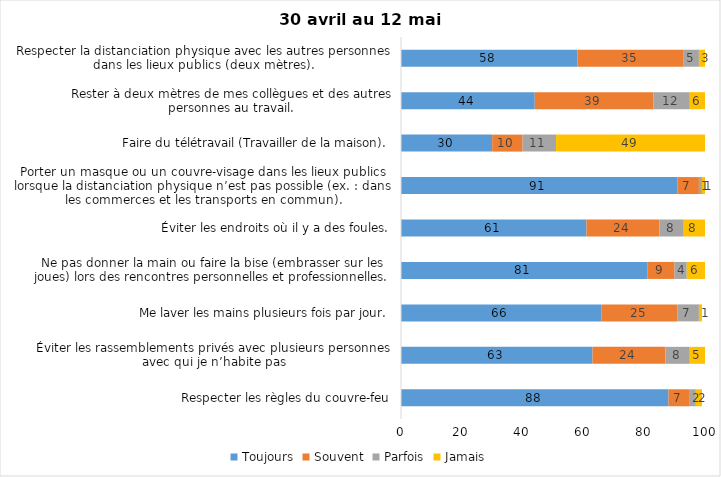
| Category | Toujours | Souvent | Parfois | Jamais |
|---|---|---|---|---|
| Respecter les règles du couvre-feu | 88 | 7 | 2 | 2 |
| Éviter les rassemblements privés avec plusieurs personnes avec qui je n’habite pas | 63 | 24 | 8 | 5 |
| Me laver les mains plusieurs fois par jour. | 66 | 25 | 7 | 1 |
| Ne pas donner la main ou faire la bise (embrasser sur les joues) lors des rencontres personnelles et professionnelles. | 81 | 9 | 4 | 6 |
| Éviter les endroits où il y a des foules. | 61 | 24 | 8 | 8 |
| Porter un masque ou un couvre-visage dans les lieux publics lorsque la distanciation physique n’est pas possible (ex. : dans les commerces et les transports en commun). | 91 | 7 | 1 | 1 |
| Faire du télétravail (Travailler de la maison). | 30 | 10 | 11 | 49 |
| Rester à deux mètres de mes collègues et des autres personnes au travail. | 44 | 39 | 12 | 6 |
| Respecter la distanciation physique avec les autres personnes dans les lieux publics (deux mètres). | 58 | 35 | 5 | 3 |